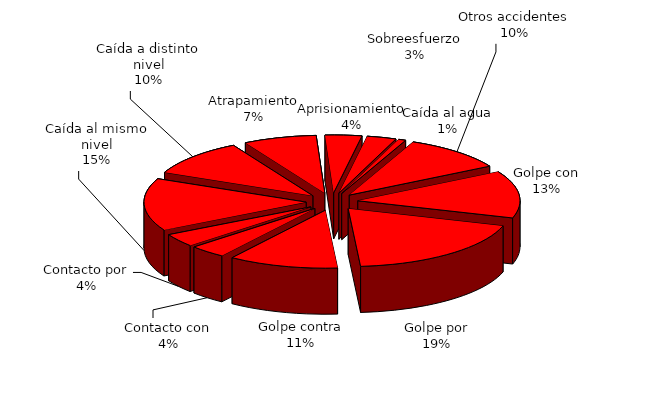
| Category | Series 0 |
|---|---|
| Golpe con | 18 |
| Golpe por | 26 |
| Golpe contra | 15 |
| Contacto con | 5 |
| Contacto por | 5 |
| Caída al mismo nivel | 20 |
| Caída a distinto nivel | 14 |
| Atrapamiento | 10 |
| Aprisionamiento | 5 |
| Sobreesfuerzo | 4 |
| Caída al agua | 1 |
| Otros accidentes | 14 |